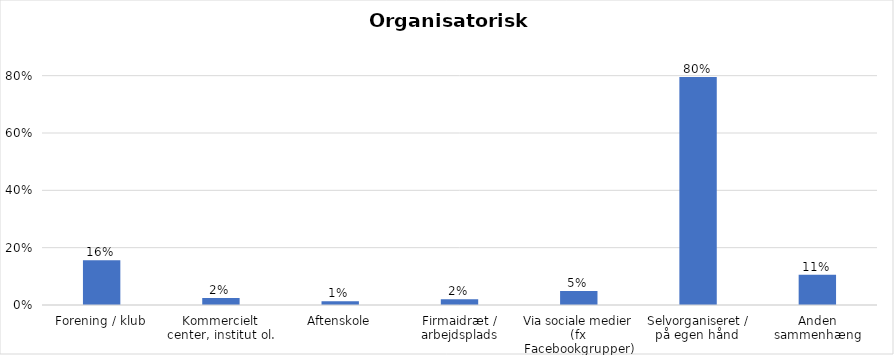
| Category | % |
|---|---|
| Forening / klub | 0.156 |
| Kommercielt center, institut ol. | 0.025 |
| Aftenskole | 0.013 |
| Firmaidræt / arbejdsplads | 0.02 |
| Via sociale medier (fx Facebookgrupper) | 0.049 |
| Selvorganiseret / på egen hånd  | 0.795 |
| Anden sammenhæng | 0.106 |